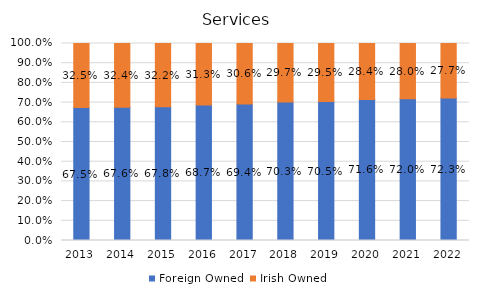
| Category | Foreign Owned | Irish Owned |
|---|---|---|
| 2013 | 0.675 | 0.325 |
| 2014 | 0.676 | 0.324 |
| 2015 | 0.678 | 0.322 |
| 2016 | 0.687 | 0.313 |
| 2017 | 0.694 | 0.306 |
| 2018 | 0.703 | 0.297 |
| 2019 | 0.705 | 0.295 |
| 2020 | 0.716 | 0.284 |
| 2021 | 0.72 | 0.28 |
| 2022 | 0.723 | 0.277 |